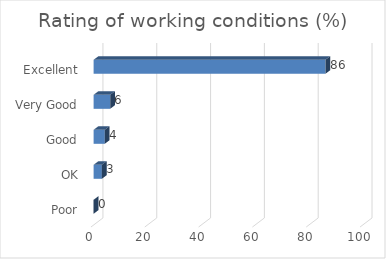
| Category | Rating of working conditions (%) |
|---|---|
| Poor | 0 |
| OK | 3.07 |
| Good | 4.16 |
| Very Good | 6.15 |
| Excellent | 86.15 |